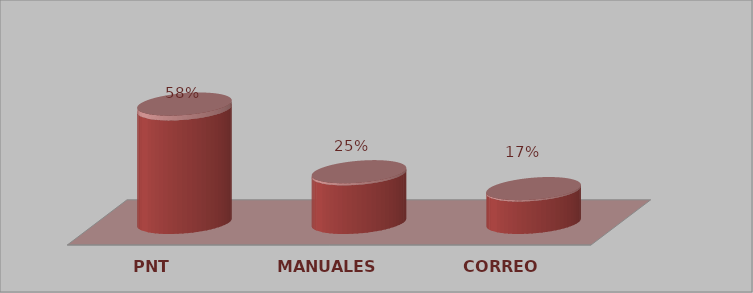
| Category | Series 0 | Series 1 |
|---|---|---|
| PNT | 14 | 0.583 |
| MANUALES | 6 | 0.25 |
| CORREO | 4 | 0.167 |